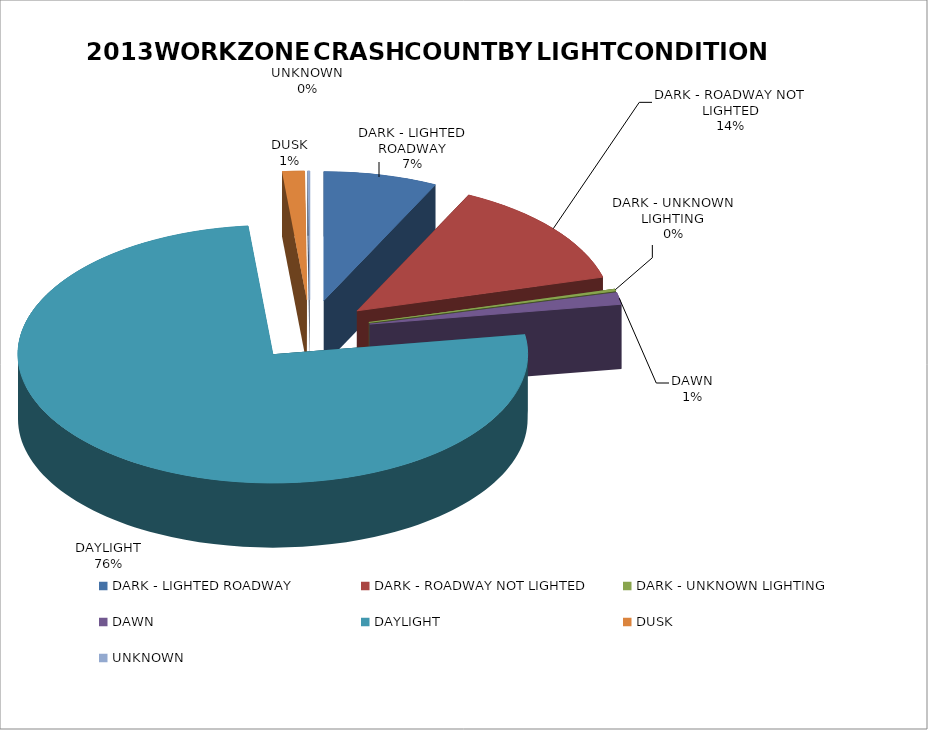
| Category | Series 0 | Series 1 |
|---|---|---|
| DARK - LIGHTED ROADWAY | 251 | 0.072 |
| DARK - ROADWAY NOT LIGHTED | 472 | 0.136 |
| DARK - UNKNOWN LIGHTING | 9 | 0.003 |
| DAWN | 52 | 0.015 |
| DAYLIGHT | 2641 | 0.759 |
| DUSK | 49 | 0.014 |
| UNKNOWN | 5 | 0.001 |